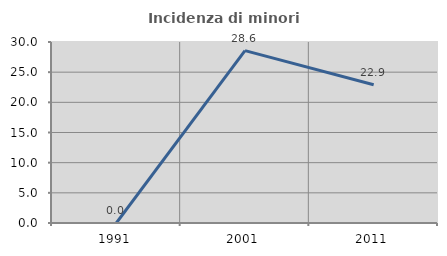
| Category | Incidenza di minori stranieri |
|---|---|
| 1991.0 | 0 |
| 2001.0 | 28.571 |
| 2011.0 | 22.917 |